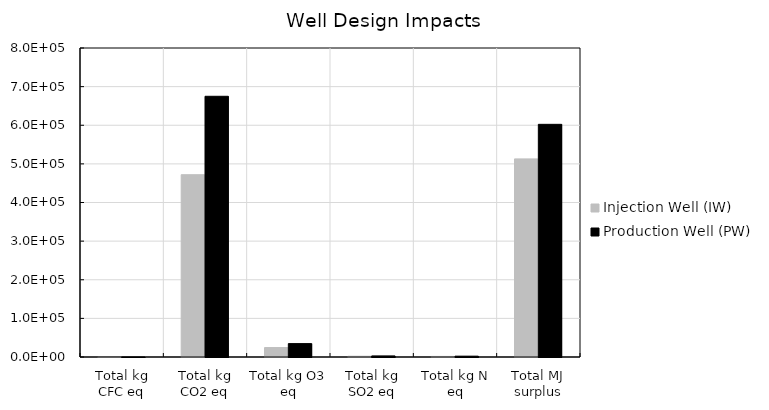
| Category | Injection Well (IW) | Production Well (PW) |
|---|---|---|
| Total kg CFC eq | 0.061 | 0.072 |
| Total kg CO2 eq | 471996.287 | 674962.119 |
| Total kg O3 eq | 24451.573 | 34688.939 |
| Total kg SO2 eq | 1995.936 | 2799.881 |
| Total kg N eq | 1516.124 | 2167.627 |
| Total MJ surplus | 512914.577 | 602369.811 |